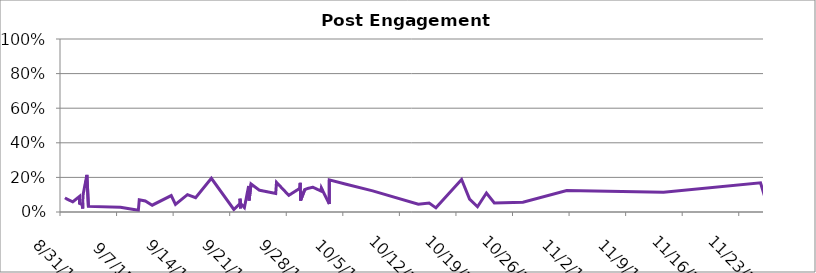
| Category | Post Engagement Rate |
|---|---|
| 42247.6752662037 | 0.07 |
| 42247.765706018516 | 0.077 |
| 42248.57642361111 | 0.059 |
| 42249.42611111111 | 0.091 |
| 42249.427824074075 | 0.05 |
| 42249.74252314815 | 0.043 |
| 42249.80165509259 | 0.02 |
| 42249.803298611114 | 0.054 |
| 42249.86681712963 | 0.102 |
| 42250.3280787037 | 0.214 |
| 42250.514027777775 | 0.032 |
| 42254.48028935185 | 0.027 |
| 42256.69525462963 | 0.01 |
| 42256.81018518518 | 0.07 |
| 42257.55502314815 | 0.064 |
| 42258.4096412037 | 0.039 |
| 42260.76559027778 | 0.095 |
| 42261.29167824074 | 0.044 |
| 42262.77261574074 | 0.1 |
| 42263.782314814816 | 0.083 |
| 42265.73296296296 | 0.195 |
| 42268.51144675926 | 0.014 |
| 42269.28126157408 | 0.049 |
| 42269.28146990741 | 0.077 |
| 42269.35190972222 | 0.021 |
| 42269.35275462963 | 0.049 |
| 42269.819699074076 | 0.025 |
| 42270.34824074074 | 0.151 |
| 42270.400868055556 | 0.067 |
| 42270.64430555556 | 0.162 |
| 42271.66667824074 | 0.126 |
| 42273.69412037037 | 0.107 |
| 42273.793912037036 | 0.171 |
| 42275.3125 | 0.096 |
| 42276.66667824074 | 0.137 |
| 42276.729166666664 | 0.168 |
| 42276.770844907405 | 0.066 |
| 42277.29167824074 | 0.13 |
| 42277.708344907405 | 0.137 |
| 42278.291666666664 | 0.143 |
| 42279.28984953704 | 0.121 |
| 42279.34568287037 | 0.139 |
| 42280.326736111114 | 0.046 |
| 42280.32865740741 | 0.186 |
| 42282.29167824074 | 0.161 |
| 42285.6977662037 | 0.122 |
| 42291.34409722222 | 0.045 |
| 42292.6875 | 0.051 |
| 42293.520844907405 | 0.024 |
| 42296.698900462965 | 0.188 |
| 42297.686215277776 | 0.074 |
| 42298.668229166666 | 0.03 |
| 42299.77402777778 | 0.11 |
| 42300.74920138889 | 0.053 |
| 42304.29167824074 | 0.056 |
| 42309.70888888889 | 0.124 |
| 42321.6903125 | 0.115 |
| 42333.69207175926 | 0.169 |
| 42334.41578703704 | 0.057 |